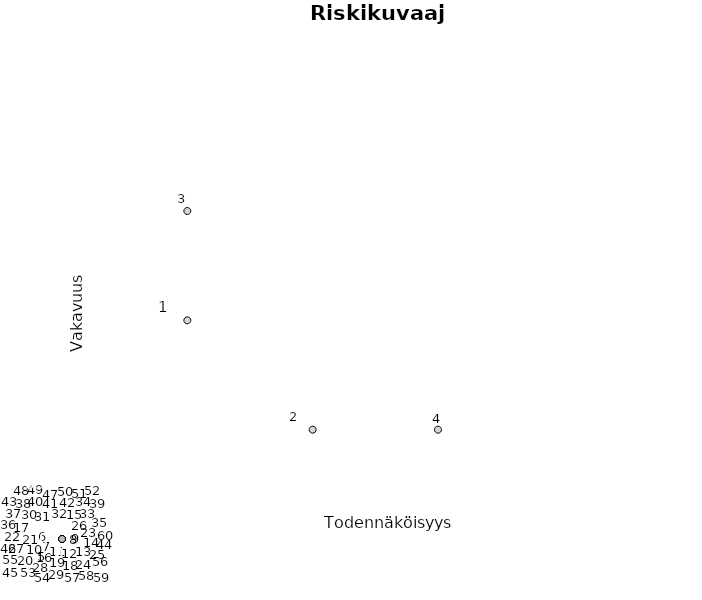
| Category | Riskiluku |
|---|---|
| 1.0 | 2 |
| 2.0 | 1 |
| 1.0 | 3 |
| 3.0 | 1 |
| 0.0 | 0 |
| 0.0 | 0 |
| 0.0 | 0 |
| 0.0 | 0 |
| 0.0 | 0 |
| 0.0 | 0 |
| 0.0 | 0 |
| 0.0 | 0 |
| 0.0 | 0 |
| 0.0 | 0 |
| 0.0 | 0 |
| 0.0 | 0 |
| 0.0 | 0 |
| 0.0 | 0 |
| 0.0 | 0 |
| 0.0 | 0 |
| 0.0 | 0 |
| 0.0 | 0 |
| 0.0 | 0 |
| 0.0 | 0 |
| 0.0 | 0 |
| 0.0 | 0 |
| 0.0 | 0 |
| 0.0 | 0 |
| 0.0 | 0 |
| 0.0 | 0 |
| 0.0 | 0 |
| 0.0 | 0 |
| 0.0 | 0 |
| 0.0 | 0 |
| 0.0 | 0 |
| 0.0 | 0 |
| 0.0 | 0 |
| 0.0 | 0 |
| 0.0 | 0 |
| 0.0 | 0 |
| 0.0 | 0 |
| 0.0 | 0 |
| 0.0 | 0 |
| 0.0 | 0 |
| 0.0 | 0 |
| 0.0 | 0 |
| 0.0 | 0 |
| 0.0 | 0 |
| 0.0 | 0 |
| 0.0 | 0 |
| 0.0 | 0 |
| 0.0 | 0 |
| 0.0 | 0 |
| 0.0 | 0 |
| 0.0 | 0 |
| 0.0 | 0 |
| 0.0 | 0 |
| 0.0 | 0 |
| 0.0 | 0 |
| 0.0 | 0 |